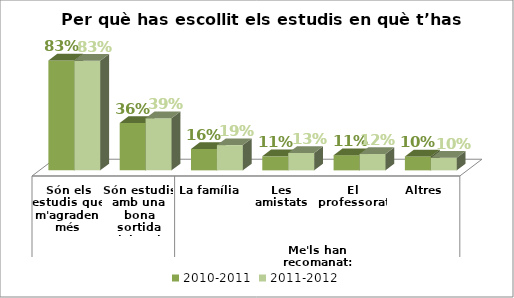
| Category | 2010-2011 | 2011-2012 |
|---|---|---|
| 0 | 0.83 | 0.827 |
| 1 | 0.357 | 0.394 |
| 2 | 0.161 | 0.191 |
| 3 | 0.106 | 0.131 |
| 4 | 0.115 | 0.123 |
| 5 | 0.105 | 0.095 |